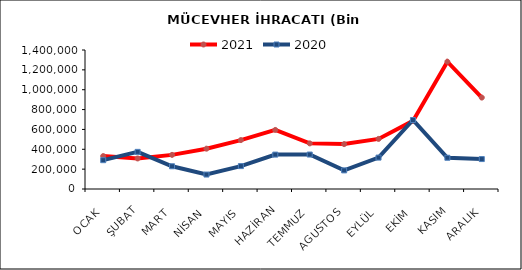
| Category | 2021 | 2020 |
|---|---|---|
| OCAK | 331571.661 | 290300.443 |
| ŞUBAT | 307688.087 | 374002.956 |
| MART | 343662.147 | 228975.815 |
| NİSAN | 406145.423 | 145571.756 |
| MAYIS | 492628.344 | 230640.464 |
| HAZİRAN | 594799.275 | 346434.361 |
| TEMMUZ | 459517.009 | 347043.657 |
| AGUSTOS | 452278.445 | 187487.854 |
| EYLÜL | 504442.876 | 316252.737 |
| EKİM | 686042.111 | 694774.879 |
| KASIM | 1282313.302 | 314690.482 |
| ARALIK | 920781.296 | 301404.193 |